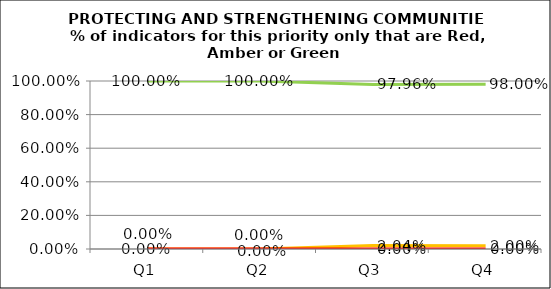
| Category | Green | Amber | Red |
|---|---|---|---|
| Q1 | 1 | 0 | 0 |
| Q2 | 1 | 0 | 0 |
| Q3 | 0.98 | 0.02 | 0 |
| Q4 | 0.98 | 0.02 | 0 |